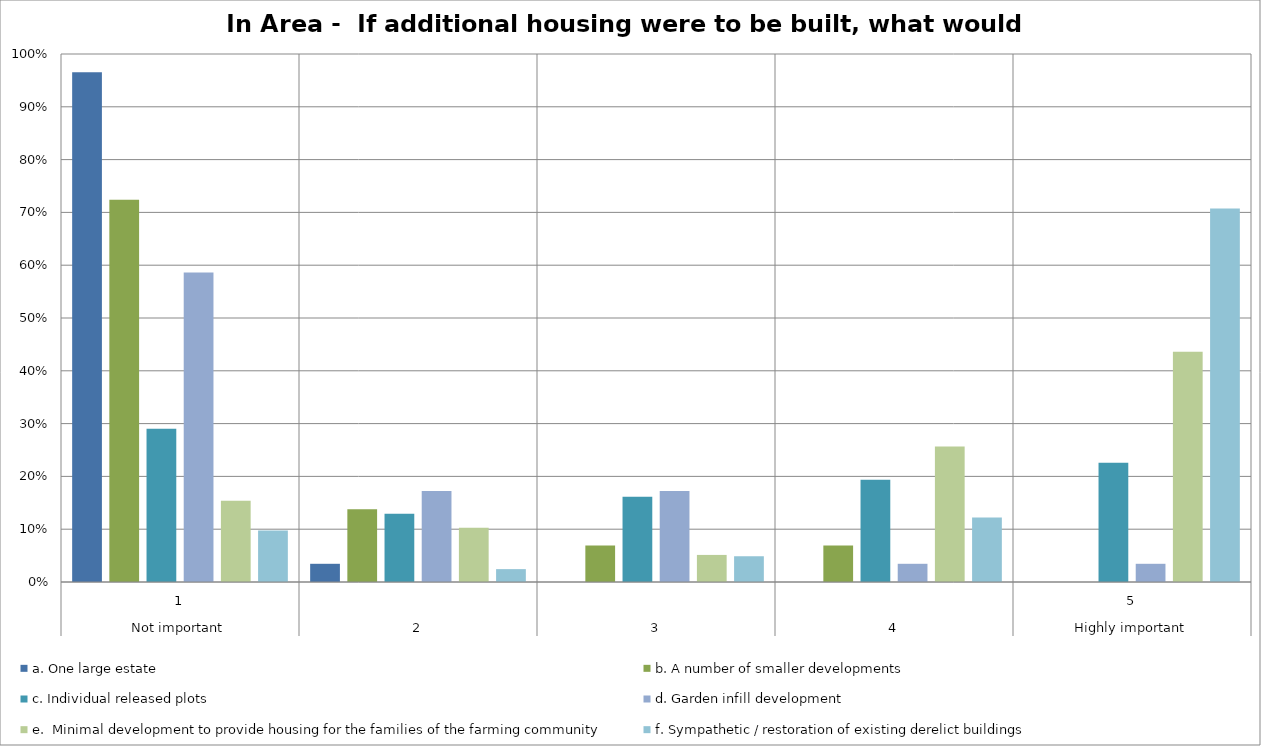
| Category | a. One large estate | b. A number of smaller developments | c. Individual released plots | d. Garden infill development | e.  Minimal development to provide housing for the families of the farming community | f. Sympathetic / restoration of existing derelict buildings |
|---|---|---|---|---|---|---|
| 0 | 0.966 | 0.724 | 0.29 | 0.586 | 0.154 | 0.098 |
| 1 | 0.034 | 0.138 | 0.129 | 0.172 | 0.103 | 0.024 |
| 2 | 0 | 0.069 | 0.161 | 0.172 | 0.051 | 0.049 |
| 3 | 0 | 0.069 | 0.194 | 0.034 | 0.256 | 0.122 |
| 4 | 0 | 0 | 0.226 | 0.034 | 0.436 | 0.707 |